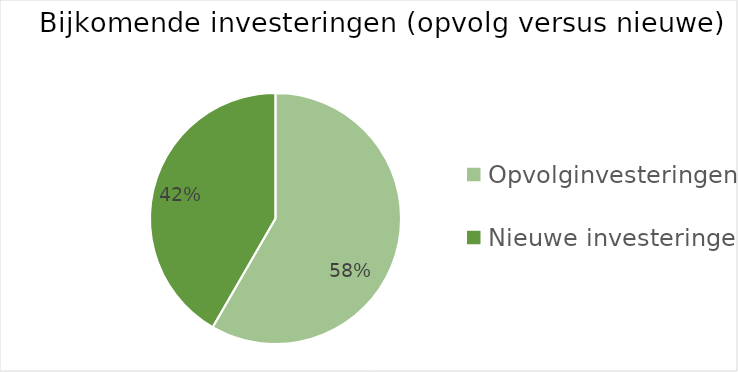
| Category | Series 0 |
|---|---|
| Opvolginvesteringen | 11.749 |
| Nieuwe investeringen | 8.39 |